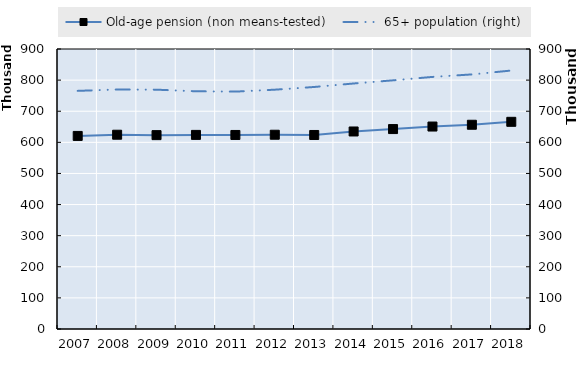
| Category | Old-age pension (non means-tested) |
|---|---|
| 2007.0 | 620580 |
| 2008.0 | 624467 |
| 2009.0 | 623128 |
| 2010.0 | 623893 |
| 2011.0 | 623683 |
| 2012.0 | 624412 |
| 2013.0 | 623626 |
| 2014.0 | 634883 |
| 2015.0 | 642646 |
| 2016.0 | 650781 |
| 2017.0 | 656501 |
| 2018.0 | 665959 |